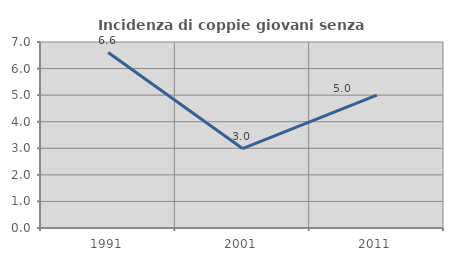
| Category | Incidenza di coppie giovani senza figli |
|---|---|
| 1991.0 | 6.604 |
| 2001.0 | 2.99 |
| 2011.0 | 5 |